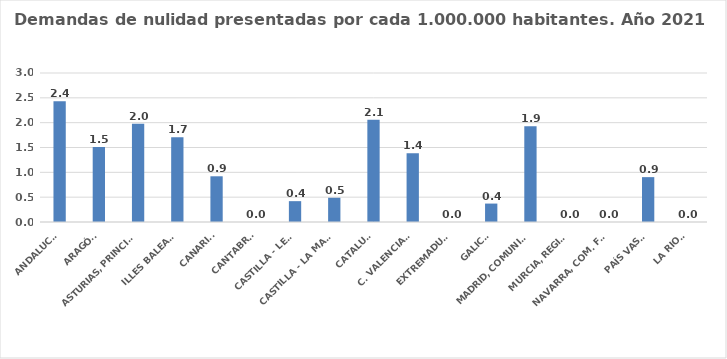
| Category | Series 0 |
|---|---|
| ANDALUCÍA | 2.43 |
| ARAGÓN | 1.508 |
| ASTURIAS, PRINCIPADO | 1.977 |
| ILLES BALEARS | 1.705 |
| CANARIAS | 0.92 |
| CANTABRIA | 0 |
| CASTILLA - LEÓN | 0.42 |
| CASTILLA - LA MANCHA | 0.488 |
| CATALUÑA | 2.061 |
| C. VALENCIANA | 1.384 |
| EXTREMADURA | 0 |
| GALICIA | 0.371 |
| MADRID, COMUNIDAD | 1.926 |
| MURCIA, REGIÓN | 0 |
| NAVARRA, COM. FORAL | 0 |
| PAÍS VASCO | 0.903 |
| LA RIOJA | 0 |